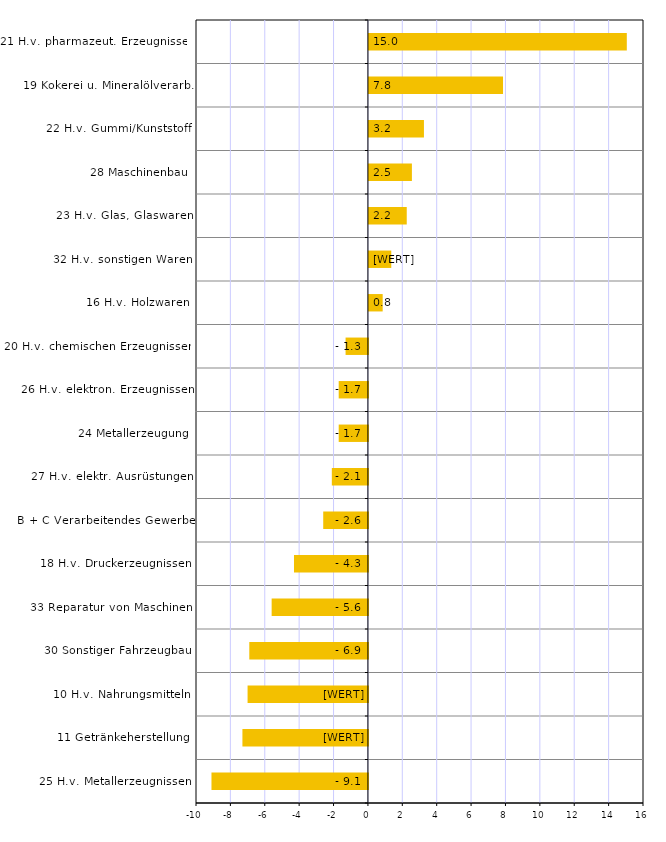
| Category | Series 0 |
|---|---|
| 25 H.v. Metallerzeugnissen | -9.1 |
| 11 Getränkeherstellung | -7.3 |
| 10 H.v. Nahrungsmitteln | -7 |
| 30 Sonstiger Fahrzeugbau | -6.9 |
| 33 Reparatur von Maschinen | -5.6 |
| 18 H.v. Druckerzeugnissen | -4.3 |
| B + C Verarbeitendes Gewerbe | -2.6 |
| 27 H.v. elektr. Ausrüstungen | -2.1 |
| 24 Metallerzeugung | -1.7 |
| 26 H.v. elektron. Erzeugnissen | -1.7 |
| 20 H.v. chemischen Erzeugnissen | -1.3 |
| 16 H.v. Holzwaren | 0.8 |
| 32 H.v. sonstigen Waren | 1.3 |
| 23 H.v. Glas, Glaswaren | 2.2 |
| 28 Maschinenbau | 2.5 |
| 22 H.v. Gummi/Kunststoff | 3.2 |
| 19 Kokerei u. Mineralölverarb. | 7.8 |
| 21 H.v. pharmazeut. Erzeugnissen | 15 |